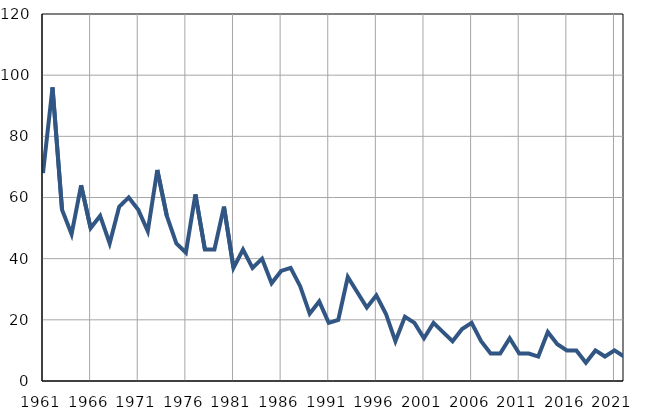
| Category | Infants
deaths |
|---|---|
| 1961.0 | 68 |
| 1962.0 | 96 |
| 1963.0 | 56 |
| 1964.0 | 48 |
| 1965.0 | 64 |
| 1966.0 | 50 |
| 1967.0 | 54 |
| 1968.0 | 45 |
| 1969.0 | 57 |
| 1970.0 | 60 |
| 1971.0 | 56 |
| 1972.0 | 49 |
| 1973.0 | 69 |
| 1974.0 | 54 |
| 1975.0 | 45 |
| 1976.0 | 42 |
| 1977.0 | 61 |
| 1978.0 | 43 |
| 1979.0 | 43 |
| 1980.0 | 57 |
| 1981.0 | 37 |
| 1982.0 | 43 |
| 1983.0 | 37 |
| 1984.0 | 40 |
| 1985.0 | 32 |
| 1986.0 | 36 |
| 1987.0 | 37 |
| 1988.0 | 31 |
| 1989.0 | 22 |
| 1990.0 | 26 |
| 1991.0 | 19 |
| 1992.0 | 20 |
| 1993.0 | 34 |
| 1994.0 | 29 |
| 1995.0 | 24 |
| 1996.0 | 28 |
| 1997.0 | 22 |
| 1998.0 | 13 |
| 1999.0 | 21 |
| 2000.0 | 19 |
| 2001.0 | 14 |
| 2002.0 | 19 |
| 2003.0 | 16 |
| 2004.0 | 13 |
| 2005.0 | 17 |
| 2006.0 | 19 |
| 2007.0 | 13 |
| 2008.0 | 9 |
| 2009.0 | 9 |
| 2010.0 | 14 |
| 2011.0 | 9 |
| 2012.0 | 9 |
| 2013.0 | 8 |
| 2014.0 | 16 |
| 2015.0 | 12 |
| 2016.0 | 10 |
| 2017.0 | 10 |
| 2018.0 | 6 |
| 2019.0 | 10 |
| 2020.0 | 8 |
| 2021.0 | 10 |
| 2022.0 | 8 |